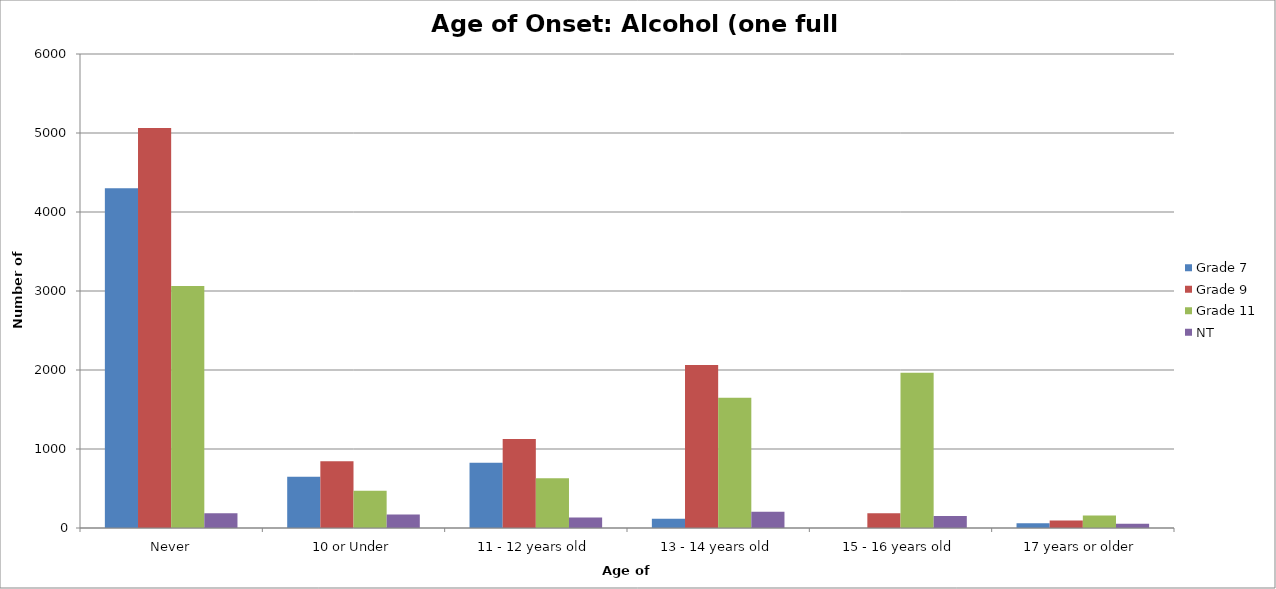
| Category | Grade 7 | Grade 9 | Grade 11 | NT |
|---|---|---|---|---|
| Never | 4301.89 | 5064.66 | 3064.23 | 187.53 |
| 10 or Under | 648.23 | 844.11 | 471.42 | 169.67 |
| 11 - 12 years old | 825.02 | 1125.48 | 628.56 | 133.95 |
| 13 - 14 years old | 117.86 | 2063.38 | 1649.97 | 205.39 |
| 15 - 16 years old | 0 | 187.58 | 1964.25 | 151.81 |
| 17 years or older | 58.93 | 93.79 | 157.14 | 53.58 |